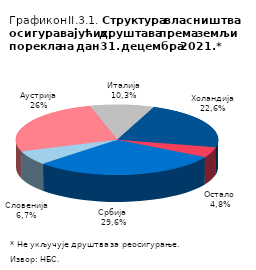
| Category | Series 0 |
|---|---|
| Србија | 0.296 |
| Словенија | 0.067 |
| Аустрија | 0.26 |
| Италија | 0.103 |
| Холандија | 0.226 |
| Остало | 0.048 |